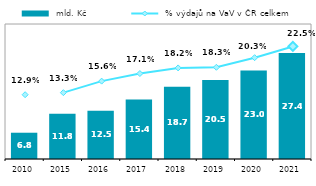
| Category |  mld. Kč |
|---|---|
| 2010.0 | 6.811 |
| 2015.0 | 11.763 |
| 2016.0 | 12.477 |
| 2017.0 | 15.448 |
| 2018.0 | 18.72 |
| 2019.0 | 20.474 |
| 2020.0 | 22.975 |
| 2021.0 | 27.45 |